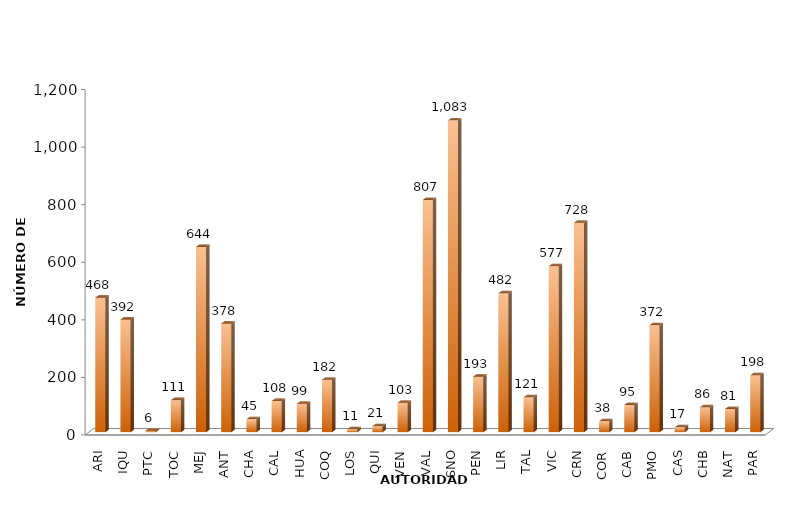
| Category | Series 0 |
|---|---|
| ARI | 467.583 |
| IQU | 391.75 |
| PTC | 5.667 |
| TOC | 111.417 |
| MEJ | 643.75 |
| ANT | 377.833 |
| CHA | 45 |
| CAL | 108.333 |
| HUA | 99 |
| COQ | 182.333 |
| LOS | 10.667 |
| QUI | 21 |
| VEN | 102.5 |
| VAL | 806.75 |
| SNO | 1083.083 |
| PEN | 193.167 |
| LIR | 482.417 |
| TAL | 121.083 |
| VIC | 576.5 |
| CRN | 727.583 |
| COR | 38.091 |
| CAB | 94.75 |
| PMO | 371.833 |
| CAS | 17.167 |
| CHB | 86.333 |
| NAT | 80.917 |
| PAR | 197.5 |